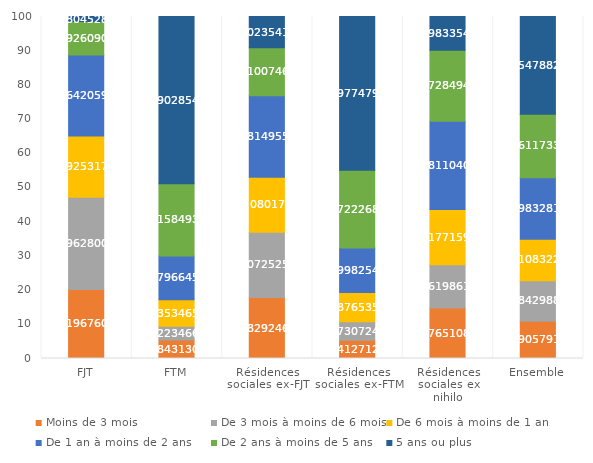
| Category | Moins de 3 mois | De 3 mois à moins de 6 mois | De 6 mois à moins de 1 an | De 1 an à moins de 2 ans | De 2 ans à moins de 5 ans | 5 ans ou plus |
|---|---|---|---|---|---|---|
| FJT | 20.197 | 26.963 | 17.925 | 23.642 | 9.793 | 1.48 |
| FTM | 5.384 | 4.022 | 7.735 | 12.797 | 21.158 | 48.903 |
| Résidences sociales ex-FJT | 17.829 | 19.073 | 16.08 | 23.815 | 14.101 | 9.102 |
| Résidences sociales ex-FTM | 5.341 | 5.373 | 8.588 | 12.998 | 22.722 | 44.977 |
| Résidences sociales ex nihilo | 14.765 | 12.62 | 16.177 | 25.811 | 20.728 | 9.898 |
| Ensemble | 10.906 | 11.843 | 12.108 | 17.983 | 18.612 | 28.548 |